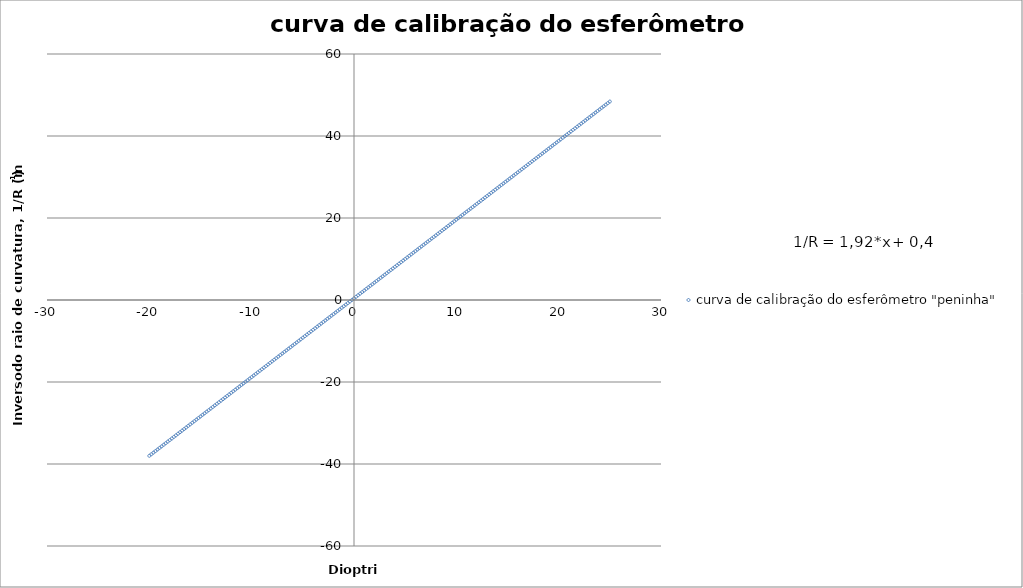
| Category | curva de calibração do esferômetro "peninha" |
|---|---|
| -20.0 | -38 |
| -19.8 | -37.616 |
| -19.6 | -37.232 |
| -19.400000000000002 | -36.848 |
| -19.200000000000003 | -36.464 |
| -19.000000000000004 | -36.08 |
| -18.800000000000004 | -35.696 |
| -18.600000000000005 | -35.312 |
| -18.400000000000006 | -34.928 |
| -18.200000000000006 | -34.544 |
| -18.000000000000007 | -34.16 |
| -17.800000000000008 | -33.776 |
| -17.60000000000001 | -33.392 |
| -17.40000000000001 | -33.008 |
| -17.20000000000001 | -32.624 |
| -17.00000000000001 | -32.24 |
| -16.80000000000001 | -31.856 |
| -16.600000000000012 | -31.472 |
| -16.400000000000013 | -31.088 |
| -16.200000000000014 | -30.704 |
| -16.000000000000014 | -30.32 |
| -15.800000000000015 | -29.936 |
| -15.600000000000016 | -29.552 |
| -15.400000000000016 | -29.168 |
| -15.200000000000017 | -28.784 |
| -15.000000000000018 | -28.4 |
| -14.800000000000018 | -28.016 |
| -14.60000000000002 | -27.632 |
| -14.40000000000002 | -27.248 |
| -14.20000000000002 | -26.864 |
| -14.000000000000021 | -26.48 |
| -13.800000000000022 | -26.096 |
| -13.600000000000023 | -25.712 |
| -13.400000000000023 | -25.328 |
| -13.200000000000024 | -24.944 |
| -13.000000000000025 | -24.56 |
| -12.800000000000026 | -24.176 |
| -12.600000000000026 | -23.792 |
| -12.400000000000027 | -23.408 |
| -12.200000000000028 | -23.024 |
| -12.000000000000028 | -22.64 |
| -11.80000000000003 | -22.256 |
| -11.60000000000003 | -21.872 |
| -11.40000000000003 | -21.488 |
| -11.200000000000031 | -21.104 |
| -11.000000000000032 | -20.72 |
| -10.800000000000033 | -20.336 |
| -10.600000000000033 | -19.952 |
| -10.400000000000034 | -19.568 |
| -10.200000000000035 | -19.184 |
| -10.000000000000036 | -18.8 |
| -9.800000000000036 | -18.416 |
| -9.600000000000037 | -18.032 |
| -9.400000000000038 | -17.648 |
| -9.200000000000038 | -17.264 |
| -9.000000000000039 | -16.88 |
| -8.80000000000004 | -16.496 |
| -8.60000000000004 | -16.112 |
| -8.400000000000041 | -15.728 |
| -8.200000000000042 | -15.344 |
| -8.000000000000043 | -14.96 |
| -7.8000000000000425 | -14.576 |
| -7.600000000000042 | -14.192 |
| -7.400000000000042 | -13.808 |
| -7.200000000000042 | -13.424 |
| -7.000000000000042 | -13.04 |
| -6.800000000000042 | -12.656 |
| -6.600000000000041 | -12.272 |
| -6.400000000000041 | -11.888 |
| -6.200000000000041 | -11.504 |
| -6.000000000000041 | -11.12 |
| -5.800000000000041 | -10.736 |
| -5.6000000000000405 | -10.352 |
| -5.40000000000004 | -9.968 |
| -5.20000000000004 | -9.584 |
| -5.00000000000004 | -9.2 |
| -4.80000000000004 | -8.816 |
| -4.60000000000004 | -8.432 |
| -4.400000000000039 | -8.048 |
| -4.200000000000039 | -7.664 |
| -4.000000000000039 | -7.28 |
| -3.800000000000039 | -6.896 |
| -3.6000000000000387 | -6.512 |
| -3.4000000000000385 | -6.128 |
| -3.2000000000000384 | -5.744 |
| -3.000000000000038 | -5.36 |
| -2.800000000000038 | -4.976 |
| -2.600000000000038 | -4.592 |
| -2.4000000000000377 | -4.208 |
| -2.2000000000000375 | -3.824 |
| -2.0000000000000373 | -3.44 |
| -1.8000000000000373 | -3.056 |
| -1.6000000000000374 | -2.672 |
| -1.4000000000000374 | -2.288 |
| -1.2000000000000375 | -1.904 |
| -1.0000000000000375 | -1.52 |
| -0.8000000000000376 | -1.136 |
| -0.6000000000000376 | -0.752 |
| -0.4000000000000376 | -0.368 |
| -0.2000000000000376 | 0.016 |
| -3.758104938356155e-14 | 0.4 |
| 0.19999999999996243 | 0.784 |
| 0.39999999999996244 | 1.168 |
| 0.5999999999999625 | 1.552 |
| 0.7999999999999625 | 1.936 |
| 0.9999999999999625 | 2.32 |
| 1.1999999999999624 | 2.704 |
| 1.3999999999999624 | 3.088 |
| 1.5999999999999623 | 3.472 |
| 1.7999999999999623 | 3.856 |
| 1.9999999999999623 | 4.24 |
| 2.1999999999999624 | 4.624 |
| 2.3999999999999626 | 5.008 |
| 2.599999999999963 | 5.392 |
| 2.799999999999963 | 5.776 |
| 2.999999999999963 | 6.16 |
| 3.1999999999999633 | 6.544 |
| 3.3999999999999635 | 6.928 |
| 3.5999999999999637 | 7.312 |
| 3.799999999999964 | 7.696 |
| 3.999999999999964 | 8.08 |
| 4.199999999999964 | 8.464 |
| 4.399999999999964 | 8.848 |
| 4.599999999999964 | 9.232 |
| 4.799999999999964 | 9.616 |
| 4.9999999999999645 | 10 |
| 5.199999999999965 | 10.384 |
| 5.399999999999965 | 10.768 |
| 5.599999999999965 | 11.152 |
| 5.799999999999965 | 11.536 |
| 5.999999999999965 | 11.92 |
| 6.1999999999999655 | 12.304 |
| 6.399999999999966 | 12.688 |
| 6.599999999999966 | 13.072 |
| 6.799999999999966 | 13.456 |
| 6.999999999999966 | 13.84 |
| 7.199999999999966 | 14.224 |
| 7.399999999999967 | 14.608 |
| 7.599999999999967 | 14.992 |
| 7.799999999999967 | 15.376 |
| 7.999999999999967 | 15.76 |
| 8.199999999999967 | 16.144 |
| 8.399999999999967 | 16.528 |
| 8.599999999999966 | 16.912 |
| 8.799999999999965 | 17.296 |
| 8.999999999999964 | 17.68 |
| 9.199999999999964 | 18.064 |
| 9.399999999999963 | 18.448 |
| 9.599999999999962 | 18.832 |
| 9.799999999999962 | 19.216 |
| 9.999999999999961 | 19.6 |
| 10.19999999999996 | 19.984 |
| 10.39999999999996 | 20.368 |
| 10.599999999999959 | 20.752 |
| 10.799999999999958 | 21.136 |
| 10.999999999999957 | 21.52 |
| 11.199999999999957 | 21.904 |
| 11.399999999999956 | 22.288 |
| 11.599999999999955 | 22.672 |
| 11.799999999999955 | 23.056 |
| 11.999999999999954 | 23.44 |
| 12.199999999999953 | 23.824 |
| 12.399999999999952 | 24.208 |
| 12.599999999999952 | 24.592 |
| 12.799999999999951 | 24.976 |
| 12.99999999999995 | 25.36 |
| 13.19999999999995 | 25.744 |
| 13.399999999999949 | 26.128 |
| 13.599999999999948 | 26.512 |
| 13.799999999999947 | 26.896 |
| 13.999999999999947 | 27.28 |
| 14.199999999999946 | 27.664 |
| 14.399999999999945 | 28.048 |
| 14.599999999999945 | 28.432 |
| 14.799999999999944 | 28.816 |
| 14.999999999999943 | 29.2 |
| 15.199999999999942 | 29.584 |
| 15.399999999999942 | 29.968 |
| 15.599999999999941 | 30.352 |
| 15.79999999999994 | 30.736 |
| 15.99999999999994 | 31.12 |
| 16.19999999999994 | 31.504 |
| 16.399999999999938 | 31.888 |
| 16.599999999999937 | 32.272 |
| 16.799999999999937 | 32.656 |
| 16.999999999999936 | 33.04 |
| 17.199999999999935 | 33.424 |
| 17.399999999999935 | 33.808 |
| 17.599999999999934 | 34.192 |
| 17.799999999999933 | 34.576 |
| 17.999999999999932 | 34.96 |
| 18.199999999999932 | 35.344 |
| 18.39999999999993 | 35.728 |
| 18.59999999999993 | 36.112 |
| 18.79999999999993 | 36.496 |
| 18.99999999999993 | 36.88 |
| 19.19999999999993 | 37.264 |
| 19.399999999999928 | 37.648 |
| 19.599999999999927 | 38.032 |
| 19.799999999999926 | 38.416 |
| 19.999999999999925 | 38.8 |
| 20.199999999999925 | 39.184 |
| 20.399999999999924 | 39.568 |
| 20.599999999999923 | 39.952 |
| 20.799999999999923 | 40.336 |
| 20.999999999999922 | 40.72 |
| 21.19999999999992 | 41.104 |
| 21.39999999999992 | 41.488 |
| 21.59999999999992 | 41.872 |
| 21.79999999999992 | 42.256 |
| 21.99999999999992 | 42.64 |
| 22.199999999999918 | 43.024 |
| 22.399999999999917 | 43.408 |
| 22.599999999999916 | 43.792 |
| 22.799999999999915 | 44.176 |
| 22.999999999999915 | 44.56 |
| 23.199999999999914 | 44.944 |
| 23.399999999999913 | 45.328 |
| 23.599999999999913 | 45.712 |
| 23.799999999999912 | 46.096 |
| 23.99999999999991 | 46.48 |
| 24.19999999999991 | 46.864 |
| 24.39999999999991 | 47.248 |
| 24.59999999999991 | 47.632 |
| 24.79999999999991 | 48.016 |
| 24.999999999999908 | 48.4 |